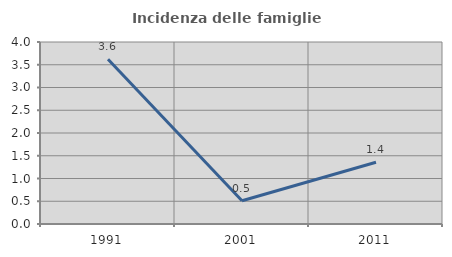
| Category | Incidenza delle famiglie numerose |
|---|---|
| 1991.0 | 3.621 |
| 2001.0 | 0.512 |
| 2011.0 | 1.356 |